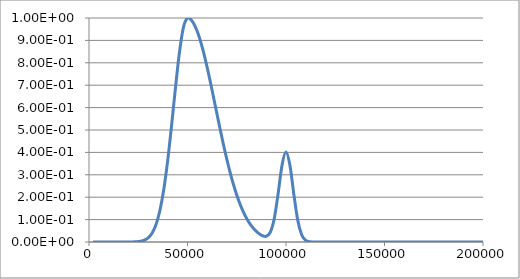
| Category | Series 0 |
|---|---|
| 2000.0 | 0 |
| 4000.0 | 0 |
| 6000.0 | 0 |
| 8000.0 | 0 |
| 10000.0 | 0 |
| 12000.0 | 0 |
| 14000.0 | 0 |
| 16000.0 | 0 |
| 18000.0 | 0 |
| 20000.0 | 0 |
| 22000.0 | 0 |
| 24000.0 | 0.001 |
| 26000.0 | 0.003 |
| 28000.0 | 0.008 |
| 30000.0 | 0.018 |
| 32000.0 | 0.039 |
| 34000.0 | 0.077 |
| 36000.0 | 0.141 |
| 38000.0 | 0.237 |
| 40000.0 | 0.368 |
| 42000.0 | 0.527 |
| 44000.0 | 0.698 |
| 46000.0 | 0.852 |
| 48000.0 | 0.961 |
| 50000.0 | 1 |
| 52000.0 | 0.99 |
| 54000.0 | 0.961 |
| 56000.0 | 0.914 |
| 58000.0 | 0.852 |
| 60000.0 | 0.779 |
| 62000.0 | 0.698 |
| 64000.0 | 0.613 |
| 66000.0 | 0.527 |
| 68000.0 | 0.445 |
| 70000.0 | 0.368 |
| 72000.0 | 0.298 |
| 74000.0 | 0.237 |
| 76000.0 | 0.185 |
| 78000.0 | 0.141 |
| 80000.0 | 0.105 |
| 82000.0 | 0.077 |
| 84000.0 | 0.056 |
| 86000.0 | 0.039 |
| 88000.0 | 0.028 |
| 90000.0 | 0.026 |
| 92000.0 | 0.043 |
| 94000.0 | 0.103 |
| 96000.0 | 0.216 |
| 98000.0 | 0.344 |
| 100000.0 | 0.402 |
| 102000.0 | 0.342 |
| 104000.0 | 0.212 |
| 106000.0 | 0.095 |
| 108000.0 | 0.031 |
| 110000.0 | 0.007 |
| 112000.0 | 0.001 |
| 114000.0 | 0 |
| 116000.0 | 0 |
| 118000.0 | 0 |
| 120000.0 | 0 |
| 122000.0 | 0 |
| 124000.0 | 0 |
| 126000.0 | 0 |
| 128000.0 | 0 |
| 130000.0 | 0 |
| 132000.0 | 0 |
| 134000.0 | 0 |
| 136000.0 | 0 |
| 138000.0 | 0 |
| 140000.0 | 0 |
| 142000.0 | 0 |
| 144000.0 | 0 |
| 146000.0 | 0 |
| 148000.0 | 0 |
| 150000.0 | 0 |
| 152000.0 | 0 |
| 154000.0 | 0 |
| 156000.0 | 0 |
| 158000.0 | 0 |
| 160000.0 | 0 |
| 162000.0 | 0 |
| 164000.0 | 0 |
| 166000.0 | 0 |
| 168000.0 | 0 |
| 170000.0 | 0 |
| 172000.0 | 0 |
| 174000.0 | 0 |
| 176000.0 | 0 |
| 178000.0 | 0 |
| 180000.0 | 0 |
| 182000.0 | 0 |
| 184000.0 | 0 |
| 186000.0 | 0 |
| 188000.0 | 0 |
| 190000.0 | 0 |
| 192000.0 | 0 |
| 194000.0 | 0 |
| 196000.0 | 0 |
| 198000.0 | 0 |
| 200000.0 | 0 |